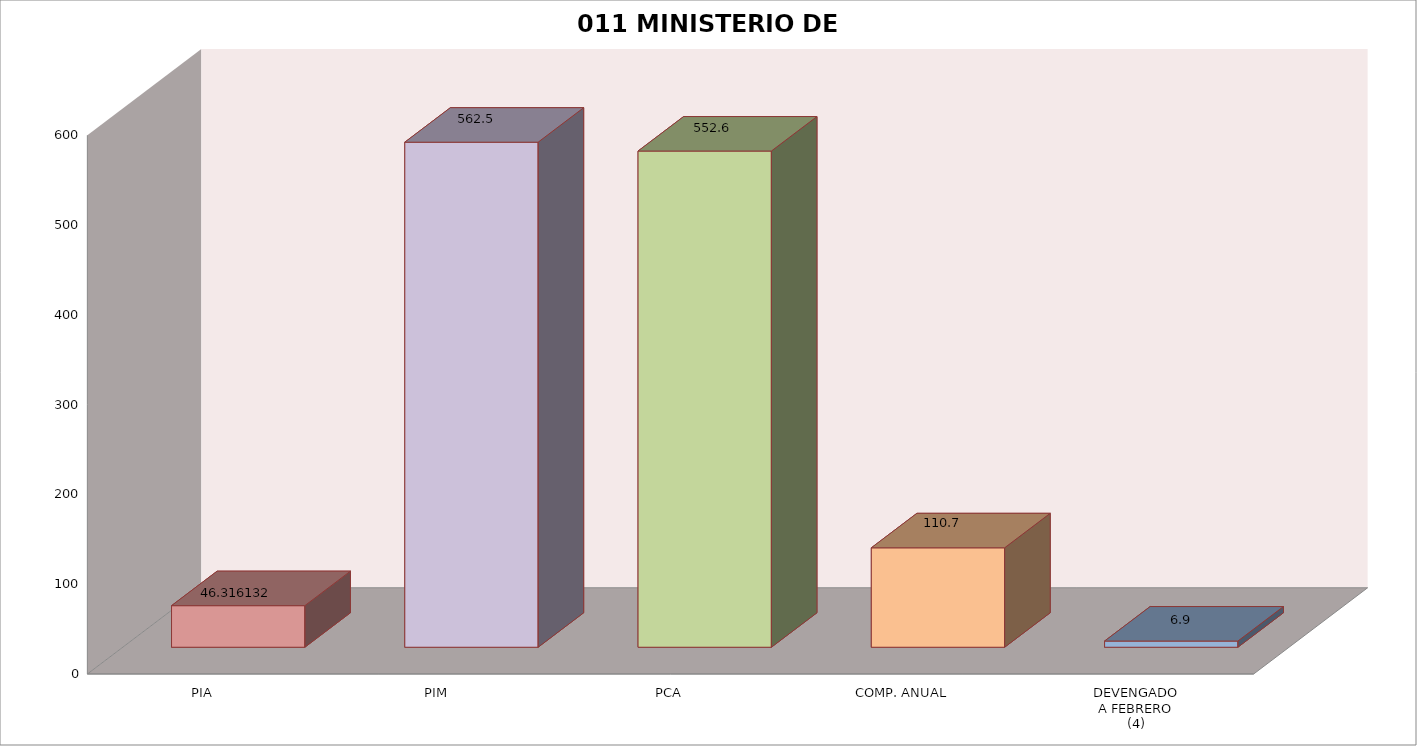
| Category | 011 MINISTERIO DE SALUD |
|---|---|
| PIA | 46.316 |
| PIM | 562.466 |
| PCA | 552.617 |
| COMP. ANUAL | 110.746 |
| DEVENGADO
A FEBRERO
(4) | 6.892 |